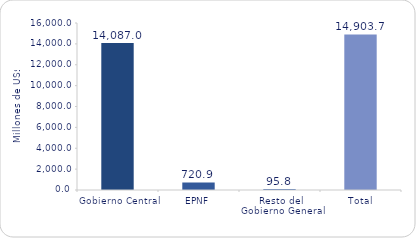
| Category | Series 1 |
|---|---|
| Gobierno Central | 14087 |
| EPNF | 720.9 |
| Resto del Gobierno General | 95.8 |
| Total | 14903.7 |